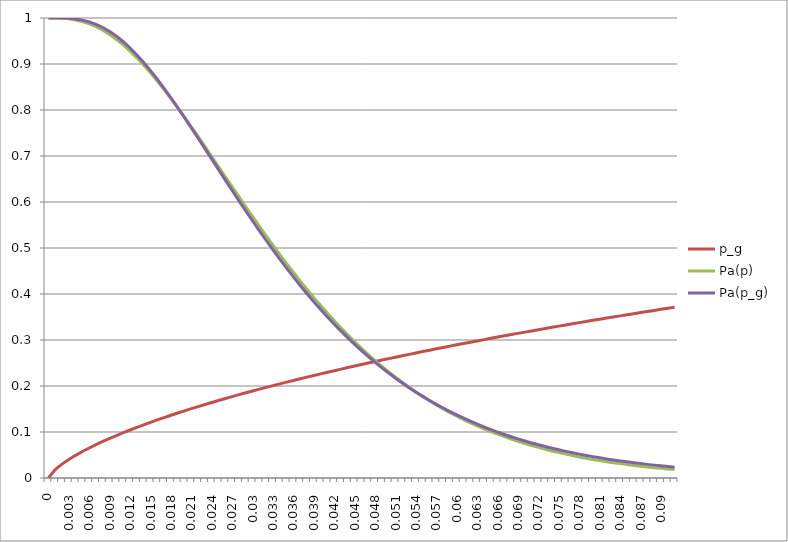
| Category | p_g | Pa(p) | Pa(p_g) |
|---|---|---|---|
| 0.0 | 0 | 1 | 1 |
| 0.001 | 0.018 | 1 | 1 |
| 0.002 | 0.03 | 0.999 | 1 |
| 0.003 | 0.04 | 0.998 | 0.999 |
| 0.004 | 0.049 | 0.996 | 0.998 |
| 0.005 | 0.058 | 0.992 | 0.995 |
| 0.006 | 0.065 | 0.987 | 0.992 |
| 0.007 | 0.073 | 0.981 | 0.986 |
| 0.008 | 0.079 | 0.973 | 0.979 |
| 0.009000000000000001 | 0.086 | 0.964 | 0.971 |
| 0.010000000000000002 | 0.092 | 0.953 | 0.96 |
| 0.011000000000000003 | 0.098 | 0.941 | 0.948 |
| 0.012000000000000004 | 0.104 | 0.928 | 0.935 |
| 0.013000000000000005 | 0.11 | 0.913 | 0.92 |
| 0.014000000000000005 | 0.116 | 0.898 | 0.903 |
| 0.015000000000000006 | 0.121 | 0.881 | 0.886 |
| 0.016000000000000007 | 0.126 | 0.863 | 0.867 |
| 0.017000000000000008 | 0.131 | 0.844 | 0.847 |
| 0.01800000000000001 | 0.136 | 0.825 | 0.827 |
| 0.01900000000000001 | 0.141 | 0.805 | 0.805 |
| 0.02000000000000001 | 0.146 | 0.784 | 0.784 |
| 0.02100000000000001 | 0.151 | 0.763 | 0.761 |
| 0.022000000000000013 | 0.155 | 0.742 | 0.739 |
| 0.023000000000000013 | 0.16 | 0.72 | 0.716 |
| 0.024000000000000014 | 0.164 | 0.699 | 0.693 |
| 0.025000000000000015 | 0.169 | 0.677 | 0.67 |
| 0.026000000000000016 | 0.173 | 0.655 | 0.648 |
| 0.027000000000000017 | 0.177 | 0.633 | 0.625 |
| 0.028000000000000018 | 0.181 | 0.611 | 0.603 |
| 0.02900000000000002 | 0.185 | 0.59 | 0.58 |
| 0.03000000000000002 | 0.189 | 0.568 | 0.559 |
| 0.03100000000000002 | 0.193 | 0.547 | 0.537 |
| 0.03200000000000002 | 0.197 | 0.526 | 0.516 |
| 0.03300000000000002 | 0.201 | 0.506 | 0.496 |
| 0.03400000000000002 | 0.205 | 0.486 | 0.476 |
| 0.035000000000000024 | 0.208 | 0.466 | 0.456 |
| 0.036000000000000025 | 0.212 | 0.447 | 0.437 |
| 0.037000000000000026 | 0.216 | 0.428 | 0.419 |
| 0.03800000000000003 | 0.219 | 0.41 | 0.401 |
| 0.03900000000000003 | 0.223 | 0.392 | 0.383 |
| 0.04000000000000003 | 0.226 | 0.375 | 0.366 |
| 0.04100000000000003 | 0.23 | 0.358 | 0.35 |
| 0.04200000000000003 | 0.233 | 0.342 | 0.334 |
| 0.04300000000000003 | 0.237 | 0.326 | 0.319 |
| 0.04400000000000003 | 0.24 | 0.311 | 0.305 |
| 0.04500000000000003 | 0.243 | 0.296 | 0.291 |
| 0.046000000000000034 | 0.247 | 0.282 | 0.277 |
| 0.047000000000000035 | 0.25 | 0.268 | 0.264 |
| 0.048000000000000036 | 0.253 | 0.255 | 0.252 |
| 0.04900000000000004 | 0.256 | 0.243 | 0.24 |
| 0.05000000000000004 | 0.26 | 0.231 | 0.228 |
| 0.05100000000000004 | 0.263 | 0.219 | 0.217 |
| 0.05200000000000004 | 0.266 | 0.208 | 0.206 |
| 0.05300000000000004 | 0.269 | 0.197 | 0.196 |
| 0.05400000000000004 | 0.272 | 0.187 | 0.187 |
| 0.05500000000000004 | 0.275 | 0.177 | 0.177 |
| 0.05600000000000004 | 0.278 | 0.168 | 0.169 |
| 0.057000000000000044 | 0.281 | 0.159 | 0.16 |
| 0.058000000000000045 | 0.284 | 0.15 | 0.152 |
| 0.059000000000000045 | 0.287 | 0.142 | 0.144 |
| 0.060000000000000046 | 0.29 | 0.134 | 0.137 |
| 0.06100000000000005 | 0.292 | 0.127 | 0.13 |
| 0.06200000000000005 | 0.295 | 0.12 | 0.123 |
| 0.06300000000000004 | 0.298 | 0.113 | 0.117 |
| 0.06400000000000004 | 0.301 | 0.107 | 0.111 |
| 0.06500000000000004 | 0.304 | 0.101 | 0.105 |
| 0.06600000000000004 | 0.306 | 0.095 | 0.1 |
| 0.06700000000000005 | 0.309 | 0.09 | 0.095 |
| 0.06800000000000005 | 0.312 | 0.085 | 0.09 |
| 0.06900000000000005 | 0.314 | 0.08 | 0.085 |
| 0.07000000000000005 | 0.317 | 0.075 | 0.08 |
| 0.07100000000000005 | 0.32 | 0.071 | 0.076 |
| 0.07200000000000005 | 0.322 | 0.066 | 0.072 |
| 0.07300000000000005 | 0.325 | 0.063 | 0.068 |
| 0.07400000000000005 | 0.328 | 0.059 | 0.065 |
| 0.07500000000000005 | 0.33 | 0.055 | 0.061 |
| 0.07600000000000005 | 0.333 | 0.052 | 0.058 |
| 0.07700000000000005 | 0.335 | 0.049 | 0.055 |
| 0.07800000000000006 | 0.338 | 0.046 | 0.052 |
| 0.07900000000000006 | 0.34 | 0.043 | 0.049 |
| 0.08000000000000006 | 0.343 | 0.04 | 0.046 |
| 0.08100000000000006 | 0.345 | 0.038 | 0.044 |
| 0.08200000000000006 | 0.348 | 0.036 | 0.042 |
| 0.08300000000000006 | 0.35 | 0.033 | 0.039 |
| 0.08400000000000006 | 0.352 | 0.031 | 0.037 |
| 0.08500000000000006 | 0.355 | 0.029 | 0.035 |
| 0.08600000000000006 | 0.357 | 0.027 | 0.033 |
| 0.08700000000000006 | 0.36 | 0.026 | 0.031 |
| 0.08800000000000006 | 0.362 | 0.024 | 0.03 |
| 0.08900000000000007 | 0.364 | 0.023 | 0.028 |
| 0.09000000000000007 | 0.367 | 0.021 | 0.026 |
| 0.09100000000000007 | 0.369 | 0.02 | 0.025 |
| 0.09200000000000007 | 0.371 | 0.018 | 0.024 |